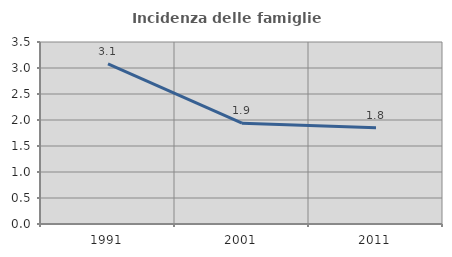
| Category | Incidenza delle famiglie numerose |
|---|---|
| 1991.0 | 3.079 |
| 2001.0 | 1.939 |
| 2011.0 | 1.85 |